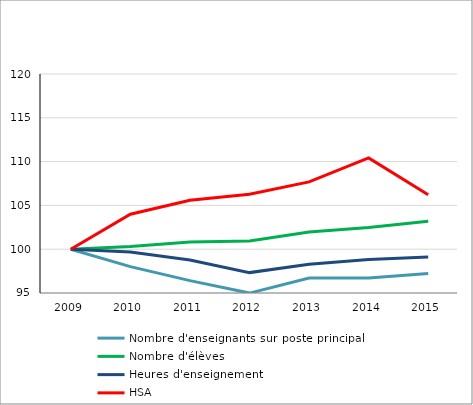
| Category | Nombre d'enseignants sur poste principal | Nombre d'élèves | Heures d'enseignement | HSA |
|---|---|---|---|---|
| 2009 | 100 | 100 | 100 | 100 |
| 2010 | 98.015 | 100.298 | 99.671 | 103.995 |
| 2011 | 96.413 | 100.809 | 98.765 | 105.578 |
| 2012 | 94.991 | 100.949 | 97.328 | 106.271 |
| 2013 | 96.712 | 101.951 | 98.27 | 107.685 |
| 2014 | 96.7 | 102.468 | 98.818 | 110.413 |
| 2015 | 97.231 | 103.191 | 99.098 | 106.206 |